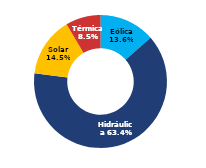
| Category | Sur |
|---|---|
| Eólica | 60.491 |
| Hidráulica | 281.887 |
| Solar | 64.581 |
| Térmica | 37.849 |